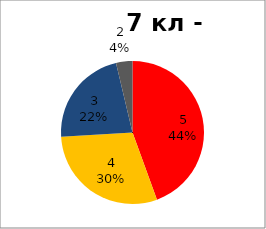
| Category | Series 0 |
|---|---|
| 5.0 | 12 |
| 4.0 | 8 |
| 3.0 | 6 |
| 2.0 | 1 |